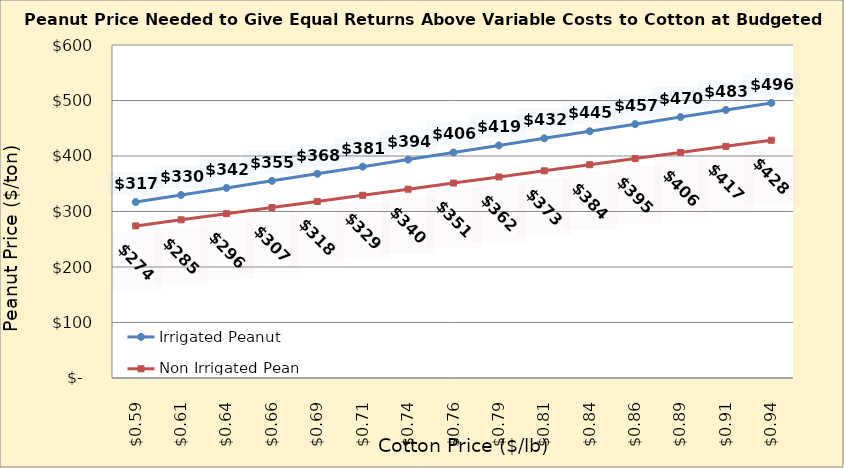
| Category | Irrigated Peanut | Non Irrigated Peanut |
|---|---|---|
| 0.5849999999999999 | 316.962 | 274.018 |
| 0.6099999999999999 | 329.728 | 285.048 |
| 0.6349999999999999 | 342.494 | 296.077 |
| 0.6599999999999999 | 355.26 | 307.106 |
| 0.6849999999999999 | 368.026 | 318.136 |
| 0.71 | 380.791 | 329.165 |
| 0.735 | 393.557 | 340.195 |
| 0.76 | 406.323 | 351.224 |
| 0.785 | 419.089 | 362.253 |
| 0.81 | 431.855 | 373.283 |
| 0.8350000000000001 | 444.621 | 384.312 |
| 0.8600000000000001 | 457.387 | 395.342 |
| 0.8850000000000001 | 470.153 | 406.371 |
| 0.9100000000000001 | 482.919 | 417.401 |
| 0.9350000000000002 | 495.685 | 428.43 |